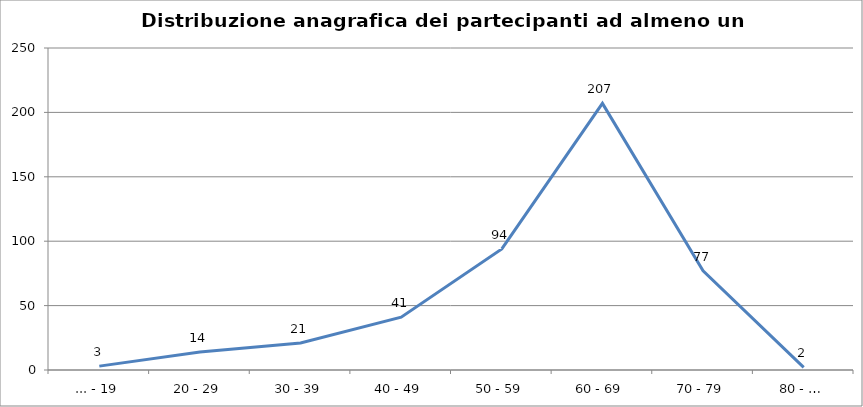
| Category | Nr. Tesserati |
|---|---|
| ... - 19 | 3 |
| 20 - 29 | 14 |
| 30 - 39 | 21 |
| 40 - 49 | 41 |
| 50 - 59 | 94 |
| 60 - 69 | 207 |
| 70 - 79 | 77 |
| 80 - … | 2 |